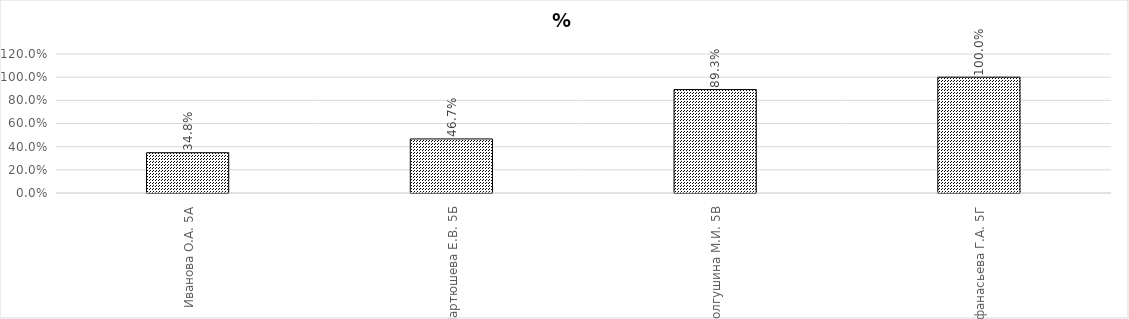
| Category | %  качества |
|---|---|
| Иванова О.А. 5А | 0.348 |
| Мартюшева Е.В. 5Б | 0.467 |
| Долгушина М.И. 5В | 0.893 |
| Афанасьева Г.А. 5Г | 1 |